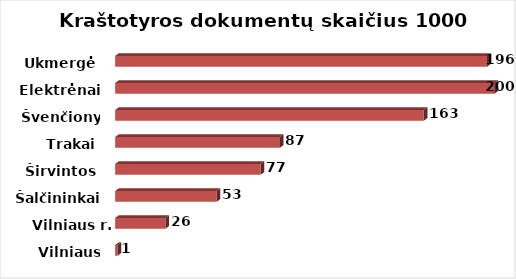
| Category | Series 0 |
|---|---|
| Vilniaus m. | 1.217 |
| Vilniaus r. | 26.469 |
| Šalčininkai | 53.47 |
| Širvintos | 76.634 |
| Trakai | 86.752 |
| Švenčionys | 162.514 |
| Elektrėnai | 199.736 |
| Ukmergė | 195.839 |